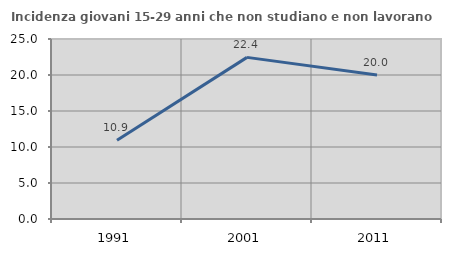
| Category | Incidenza giovani 15-29 anni che non studiano e non lavorano  |
|---|---|
| 1991.0 | 10.938 |
| 2001.0 | 22.449 |
| 2011.0 | 20 |